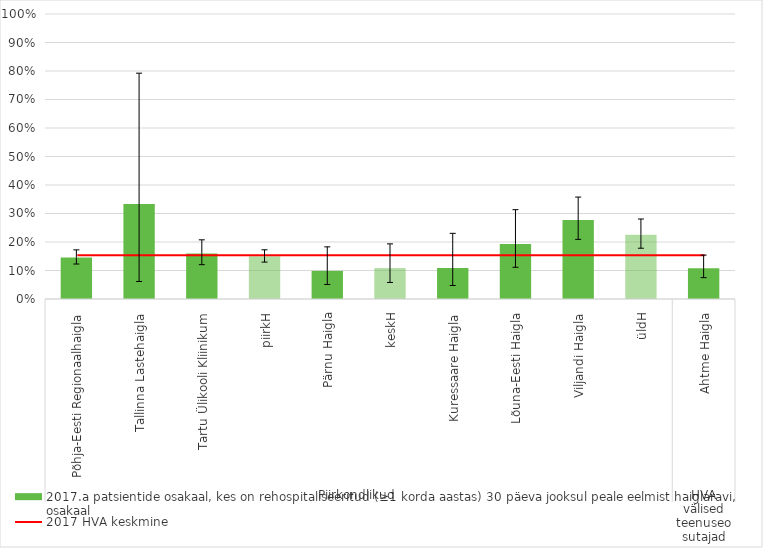
| Category | 2017.a patsientide osakaal, kes on rehospitaliseeritud (≥1 korda aastas) 30 päeva jooksul peale eelmist haiglaravi, osakaal |
|---|---|
| 0 | 0.146 |
| 1 | 0.333 |
| 2 | 0.159 |
| 3 | 0.15 |
| 4 | 0.099 |
| 5 | 0.108 |
| 6 | 0.109 |
| 7 | 0.193 |
| 8 | 0.277 |
| 9 | 0.225 |
| 10 | 0.108 |